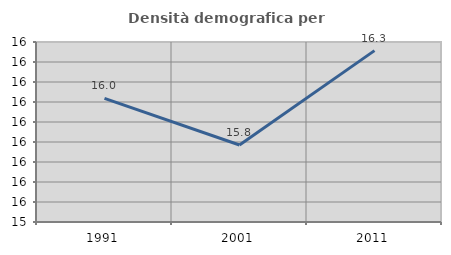
| Category | Densità demografica |
|---|---|
| 1991.0 | 16.018 |
| 2001.0 | 15.785 |
| 2011.0 | 16.257 |